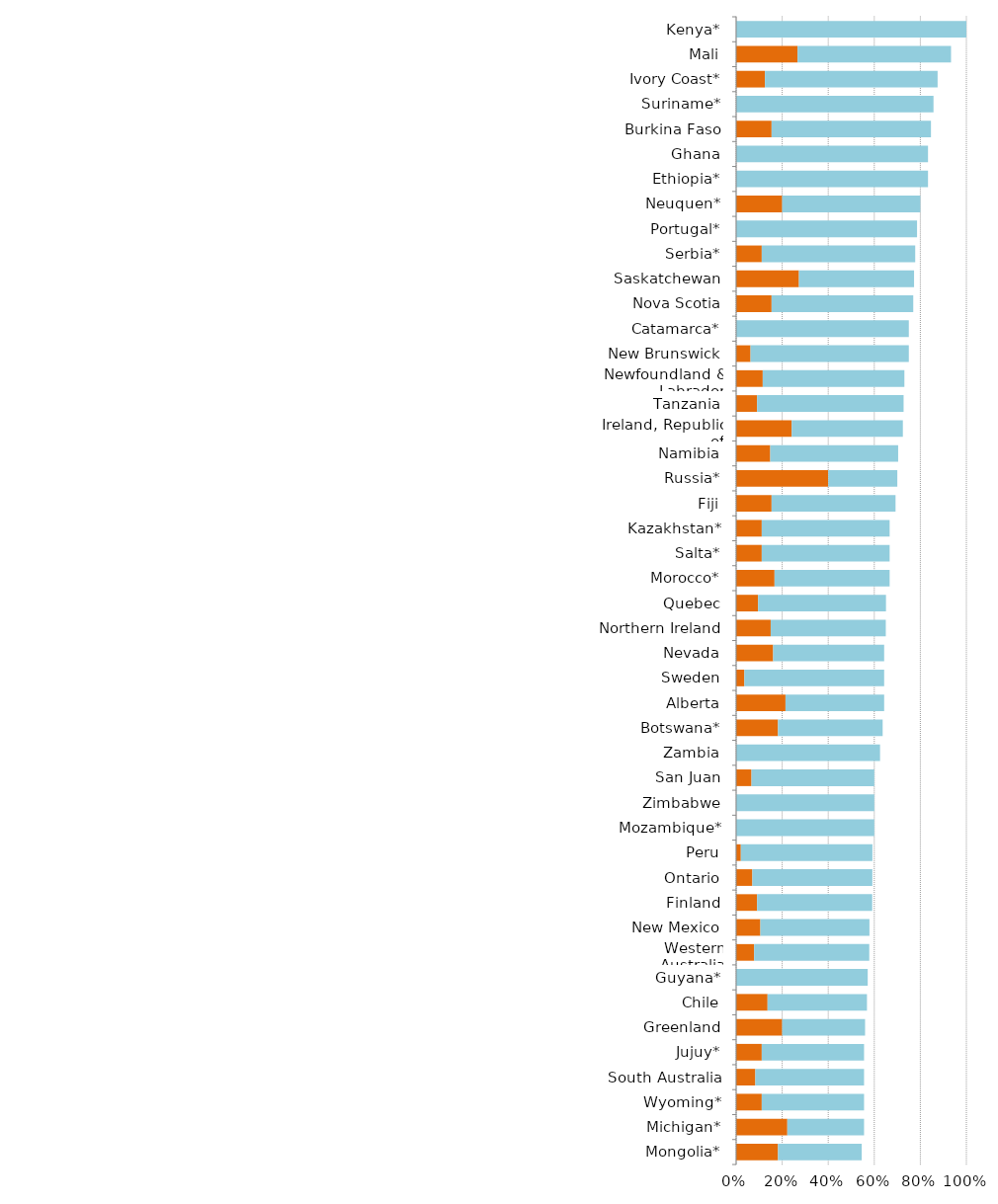
| Category | Series 0 | Series 1 |
|---|---|---|
| Mongolia* | 0.182 | 0.364 |
| Michigan* | 0.222 | 0.333 |
| Wyoming* | 0.111 | 0.444 |
| South Australia | 0.083 | 0.472 |
| Jujuy* | 0.111 | 0.444 |
| Greenland | 0.2 | 0.36 |
| Chile | 0.136 | 0.432 |
| Guyana* | 0 | 0.571 |
| Western Australia | 0.078 | 0.5 |
| New Mexico | 0.105 | 0.474 |
| Finland | 0.091 | 0.5 |
| Ontario | 0.07 | 0.521 |
| Peru | 0.02 | 0.571 |
| Mozambique* | 0 | 0.6 |
| Zimbabwe | 0 | 0.6 |
| San Juan | 0.067 | 0.533 |
| Zambia | 0 | 0.625 |
| Botswana* | 0.182 | 0.455 |
| Alberta | 0.214 | 0.429 |
| Sweden | 0.036 | 0.607 |
| Nevada | 0.161 | 0.482 |
| Northern Ireland | 0.15 | 0.5 |
| Quebec | 0.095 | 0.556 |
| Morocco* | 0.167 | 0.5 |
| Salta* | 0.111 | 0.556 |
| Kazakhstan* | 0.111 | 0.556 |
| Fiji | 0.154 | 0.538 |
| Russia* | 0.4 | 0.3 |
| Namibia | 0.148 | 0.556 |
| Ireland, Republic of | 0.241 | 0.483 |
| Tanzania | 0.091 | 0.636 |
| Newfoundland & Labrador | 0.115 | 0.615 |
| New Brunswick | 0.062 | 0.688 |
| Catamarca* | 0 | 0.75 |
| Nova Scotia | 0.154 | 0.615 |
| Saskatchewan | 0.273 | 0.5 |
| Serbia* | 0.111 | 0.667 |
| Portugal* | 0 | 0.786 |
| Neuquen* | 0.2 | 0.6 |
| Ethiopia* | 0 | 0.833 |
| Ghana | 0 | 0.833 |
| Burkina Faso | 0.154 | 0.692 |
| Suriname* | 0 | 0.857 |
| Ivory Coast* | 0.125 | 0.75 |
| Mali | 0.267 | 0.667 |
| Kenya* | 0 | 1 |